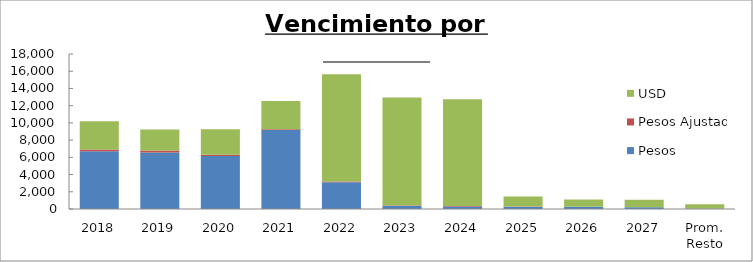
| Category | Pesos | Pesos Ajustados | USD |
|---|---|---|---|
| 2018 | 6708.794 | 203.381 | 3280.546 |
| 2019 | 6569.955 | 212.76 | 2451.504 |
| 2020 | 6148.009 | 154.973 | 2953.668 |
| 2021 | 9177.319 | 85.901 | 3269.955 |
| 2022 | 3110.608 | 77.449 | 12468.772 |
| 2023 | 336.635 | 73.024 | 12545.81 |
| 2024 | 282.167 | 59.867 | 12405.241 |
| 2025 | 268.975 | 13.519 | 1169.72 |
| 2026 | 249.045 | 1.678 | 850.966 |
| 2027 | 216.957 | 0 | 860.826 |
| Prom. Resto | 40.703 | 0 | 513.658 |